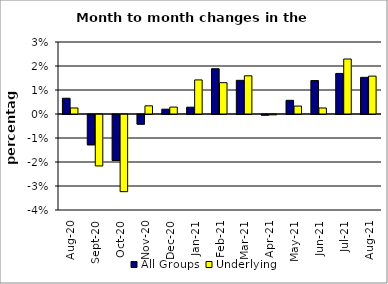
| Category | All Groups | Underlying |
|---|---|---|
| 2020-08-01 | 0.007 | 0.003 |
| 2020-09-01 | -0.013 | -0.021 |
| 2020-10-01 | -0.019 | -0.032 |
| 2020-11-01 | -0.004 | 0.003 |
| 2020-12-01 | 0.002 | 0.003 |
| 2021-01-01 | 0.003 | 0.014 |
| 2021-02-01 | 0.019 | 0.013 |
| 2021-03-01 | 0.014 | 0.016 |
| 2021-04-01 | 0 | 0 |
| 2021-05-01 | 0.006 | 0.003 |
| 2021-06-01 | 0.014 | 0.003 |
| 2021-07-01 | 0.017 | 0.023 |
| 2021-08-01 | 0.015 | 0.016 |